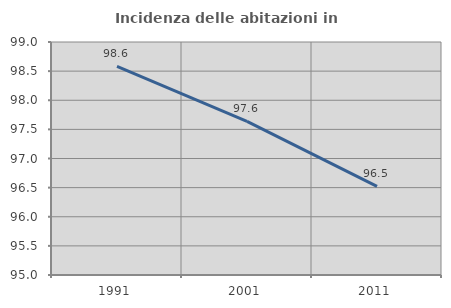
| Category | Incidenza delle abitazioni in proprietà  |
|---|---|
| 1991.0 | 98.582 |
| 2001.0 | 97.638 |
| 2011.0 | 96.522 |